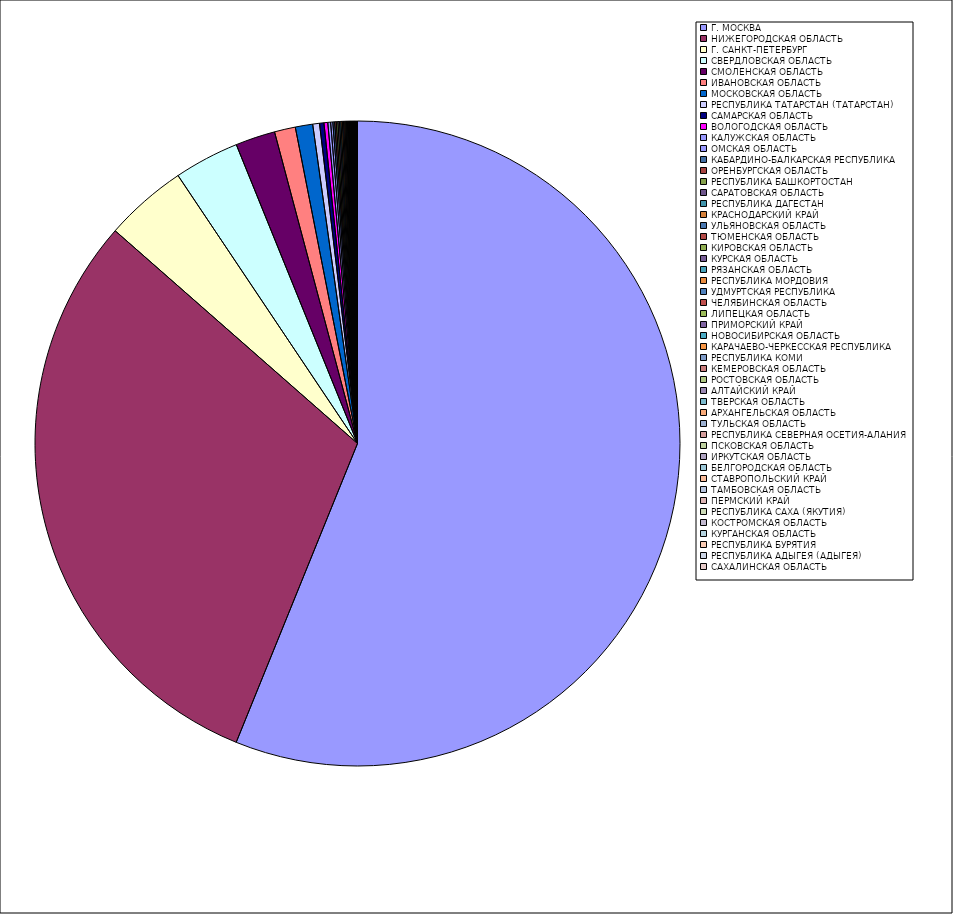
| Category | Оборот |
|---|---|
| Г. МОСКВА | 56.12 |
| НИЖЕГОРОДСКАЯ ОБЛАСТЬ | 30.32 |
| Г. САНКТ-ПЕТЕРБУРГ | 4.14 |
| СВЕРДЛОВСКАЯ ОБЛАСТЬ | 3.26 |
| СМОЛЕНСКАЯ ОБЛАСТЬ | 1.99 |
| ИВАНОВСКАЯ ОБЛАСТЬ | 1.05 |
| МОСКОВСКАЯ ОБЛАСТЬ | 0.87 |
| РЕСПУБЛИКА ТАТАРСТАН (ТАТАРСТАН) | 0.34 |
| САМАРСКАЯ ОБЛАСТЬ | 0.22 |
| ВОЛОГОДСКАЯ ОБЛАСТЬ | 0.19 |
| КАЛУЖСКАЯ ОБЛАСТЬ | 0.14 |
| ОМСКАЯ ОБЛАСТЬ | 0.11 |
| КАБАРДИНО-БАЛКАРСКАЯ РЕСПУБЛИКА | 0.09 |
| ОРЕНБУРГСКАЯ ОБЛАСТЬ | 0.08 |
| РЕСПУБЛИКА БАШКОРТОСТАН | 0.08 |
| САРАТОВСКАЯ ОБЛАСТЬ | 0.08 |
| РЕСПУБЛИКА ДАГЕСТАН | 0.07 |
| КРАСНОДАРСКИЙ КРАЙ | 0.07 |
| УЛЬЯНОВСКАЯ ОБЛАСТЬ | 0.06 |
| ТЮМЕНСКАЯ ОБЛАСТЬ | 0.06 |
| КИРОВСКАЯ ОБЛАСТЬ | 0.05 |
| КУРСКАЯ ОБЛАСТЬ | 0.04 |
| РЯЗАНСКАЯ ОБЛАСТЬ | 0.04 |
| РЕСПУБЛИКА МОРДОВИЯ | 0.04 |
| УДМУРТСКАЯ РЕСПУБЛИКА | 0.03 |
| ЧЕЛЯБИНСКАЯ ОБЛАСТЬ | 0.03 |
| ЛИПЕЦКАЯ ОБЛАСТЬ | 0.03 |
| ПРИМОРСКИЙ КРАЙ | 0.03 |
| НОВОСИБИРСКАЯ ОБЛАСТЬ | 0.03 |
| КАРАЧАЕВО-ЧЕРКЕССКАЯ РЕСПУБЛИКА | 0.02 |
| РЕСПУБЛИКА КОМИ | 0.02 |
| КЕМЕРОВСКАЯ ОБЛАСТЬ | 0.02 |
| РОСТОВСКАЯ ОБЛАСТЬ | 0.02 |
| АЛТАЙСКИЙ КРАЙ | 0.02 |
| ТВЕРСКАЯ ОБЛАСТЬ | 0.02 |
| АРХАНГЕЛЬСКАЯ ОБЛАСТЬ | 0.02 |
| ТУЛЬСКАЯ ОБЛАСТЬ | 0.02 |
| РЕСПУБЛИКА СЕВЕРНАЯ ОСЕТИЯ-АЛАНИЯ | 0.02 |
| ПСКОВСКАЯ ОБЛАСТЬ | 0.02 |
| ИРКУТСКАЯ ОБЛАСТЬ | 0.01 |
| БЕЛГОРОДСКАЯ ОБЛАСТЬ | 0.01 |
| СТАВРОПОЛЬСКИЙ КРАЙ | 0.01 |
| ТАМБОВСКАЯ ОБЛАСТЬ | 0.01 |
| ПЕРМСКИЙ КРАЙ | 0.01 |
| РЕСПУБЛИКА САХА (ЯКУТИЯ) | 0.01 |
| КОСТРОМСКАЯ ОБЛАСТЬ | 0.01 |
| КУРГАНСКАЯ ОБЛАСТЬ | 0.01 |
| РЕСПУБЛИКА БУРЯТИЯ | 0.01 |
| РЕСПУБЛИКА АДЫГЕЯ (АДЫГЕЯ) | 0.01 |
| САХАЛИНСКАЯ ОБЛАСТЬ | 0.01 |